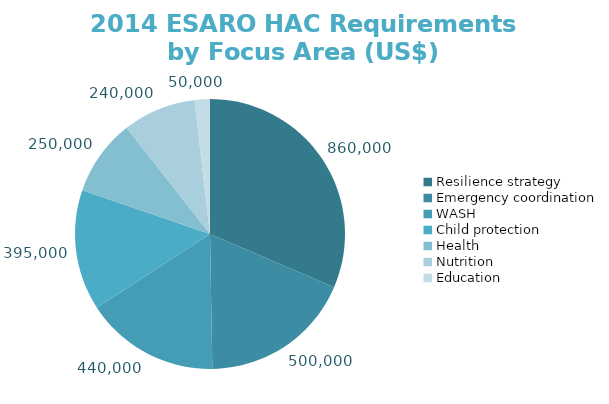
| Category | 2014 HAC requirements (US$) |
|---|---|
| Resilience strategy | 860000 |
| Emergency coordination | 500000 |
| WASH | 440000 |
| Child protection | 395000 |
| Health | 250000 |
| Nutrition | 240000 |
| Education | 50000 |